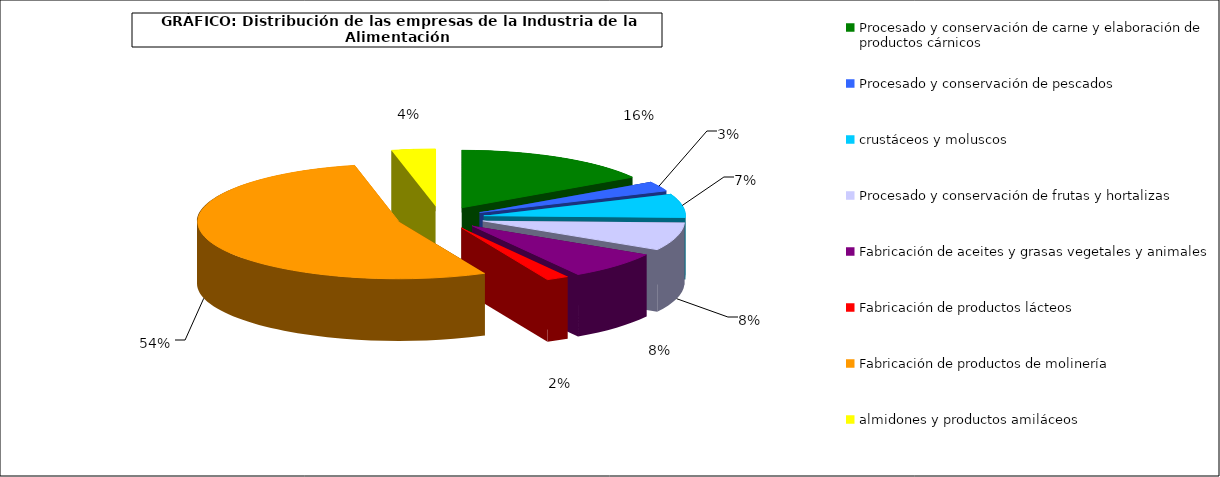
| Category | Procesado y conservación de carne y elaboración de productos cárnicos |
|---|---|
| 0 | 3477 |
| 1 | 599 |
| 2 | 1445 |
| 3 | 1707 |
| 4 | 1694 |
| 5 | 389 |
| 6 | 11591 |
| 7 | 759 |